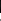
| Category | Series 0 |
|---|---|
| 2h.1 | -2.31 |
| 2h.2 | -3.52 |
| 6h.1 | -1.33 |
| 6h.2 | -1.42 |
| 30h.1 | -2.87 |
| 30h.2 | -1.82 |